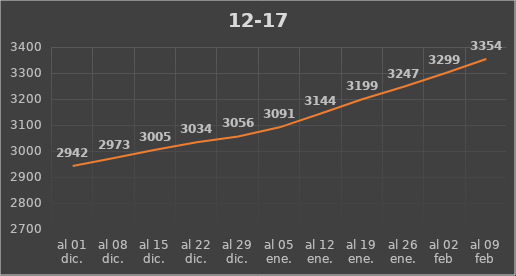
| Category | 12-17 |
|---|---|
| al 01 dic. | 2942 |
| al 08 dic. | 2973 |
| al 15 dic. | 3005 |
| al 22 dic. | 3034 |
| al 29 dic. | 3056 |
| al 05 ene. | 3091 |
| al 12 ene. | 3144 |
| al 19 ene. | 3199 |
| al 26 ene. | 3247 |
| al 02 feb | 3299 |
| al 09 feb | 3354 |